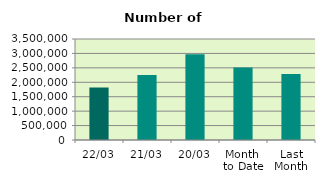
| Category | Series 0 |
|---|---|
| 22/03 | 1818050 |
| 21/03 | 2255704 |
| 20/03 | 2975714 |
| Month 
to Date | 2511936.75 |
| Last
Month | 2290810.7 |